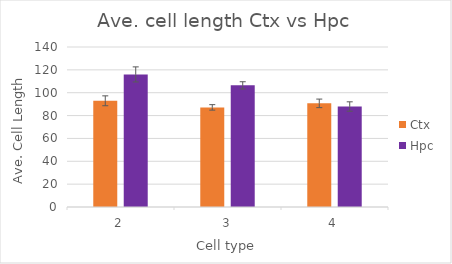
| Category | Ctx | Hpc |
|---|---|---|
| 2.0 | 92.923 | 115.999 |
| 3.0 | 87.157 | 106.43 |
| 4.0 | 90.686 | 87.929 |